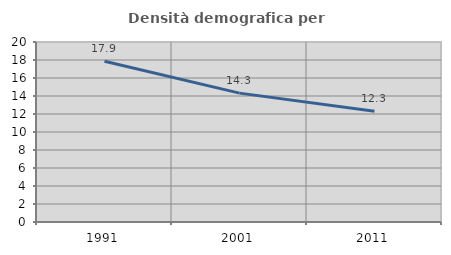
| Category | Densità demografica |
|---|---|
| 1991.0 | 17.868 |
| 2001.0 | 14.318 |
| 2011.0 | 12.307 |